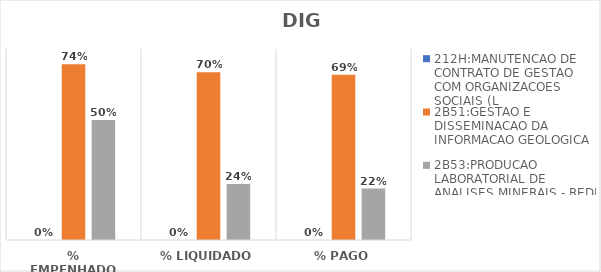
| Category | 212H:MANUTENCAO DE CONTRATO DE GESTAO COM ORGANIZACOES SOCIAIS (L | 2B51:GESTAO E DISSEMINACAO DA INFORMACAO GEOLOGICA | 2B53:PRODUCAO LABORATORIAL DE ANALISES MINERAIS - REDE LAMIN |
|---|---|---|---|
| % EMPENHADO | 0 | 0.736 | 0.503 |
| % LIQUIDADO | 0 | 0.703 | 0.235 |
| % PAGO | 0 | 0.693 | 0.216 |